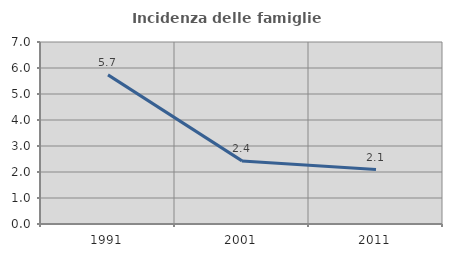
| Category | Incidenza delle famiglie numerose |
|---|---|
| 1991.0 | 5.735 |
| 2001.0 | 2.427 |
| 2011.0 | 2.095 |